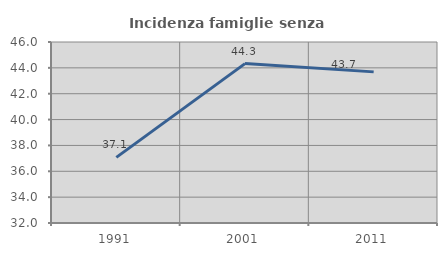
| Category | Incidenza famiglie senza nuclei |
|---|---|
| 1991.0 | 37.079 |
| 2001.0 | 44.33 |
| 2011.0 | 43.689 |